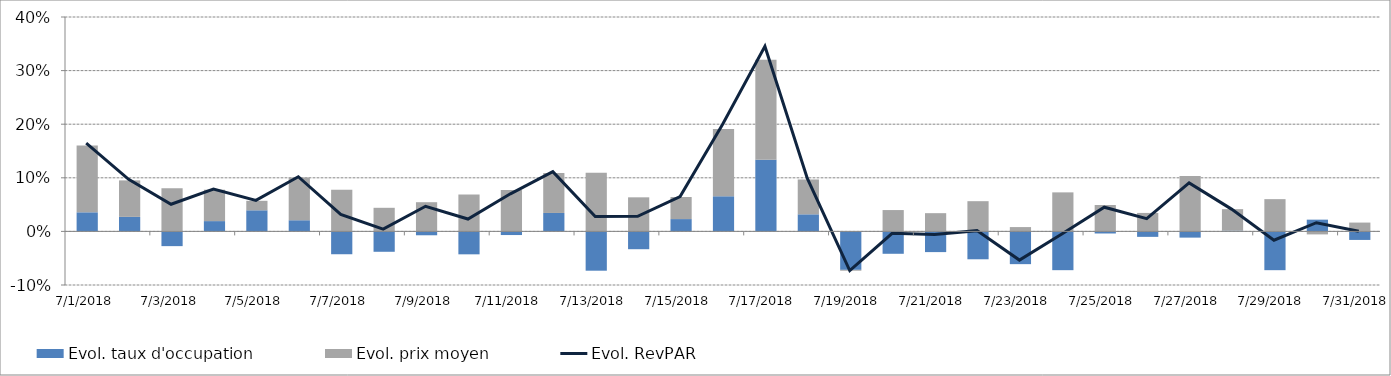
| Category | Evol. taux d'occupation | Evol. prix moyen |
|---|---|---|
| 7/1/18 | 0.036 | 0.124 |
| 7/2/18 | 0.027 | 0.068 |
| 7/3/18 | -0.027 | 0.08 |
| 7/4/18 | 0.019 | 0.059 |
| 7/5/18 | 0.039 | 0.018 |
| 7/6/18 | 0.021 | 0.08 |
| 7/7/18 | -0.043 | 0.078 |
| 7/8/18 | -0.038 | 0.044 |
| 7/9/18 | -0.007 | 0.054 |
| 7/10/18 | -0.043 | 0.069 |
| 7/11/18 | -0.007 | 0.077 |
| 7/12/18 | 0.034 | 0.075 |
| 7/13/18 | -0.073 | 0.109 |
| 7/14/18 | -0.033 | 0.064 |
| 7/15/18 | 0.023 | 0.041 |
| 7/16/18 | 0.066 | 0.126 |
| 7/17/18 | 0.134 | 0.187 |
| 7/18/18 | 0.032 | 0.065 |
| 7/19/18 | -0.072 | -0.002 |
| 7/20/18 | -0.042 | 0.04 |
| 7/21/18 | -0.039 | 0.034 |
| 7/22/18 | -0.052 | 0.056 |
| 7/23/18 | -0.061 | 0.008 |
| 7/24/18 | -0.072 | 0.073 |
| 7/25/18 | -0.004 | 0.049 |
| 7/26/18 | -0.01 | 0.034 |
| 7/27/18 | -0.012 | 0.103 |
| 7/28/18 | 0.001 | 0.04 |
| 7/29/18 | -0.072 | 0.06 |
| 7/30/18 | 0.022 | -0.006 |
| 7/31/18 | -0.016 | 0.016 |